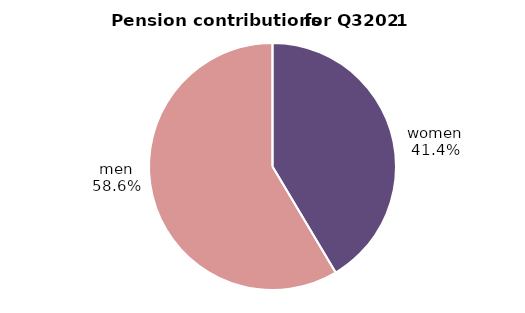
| Category | Series 0 |
|---|---|
| women | 41.936 |
| men | 59.243 |